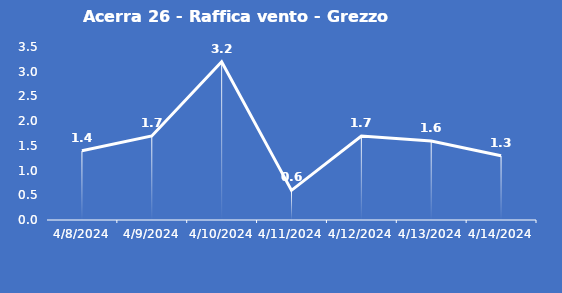
| Category | Acerra 26 - Raffica vento - Grezzo (m/s) |
|---|---|
| 4/8/24 | 1.4 |
| 4/9/24 | 1.7 |
| 4/10/24 | 3.2 |
| 4/11/24 | 0.6 |
| 4/12/24 | 1.7 |
| 4/13/24 | 1.6 |
| 4/14/24 | 1.3 |